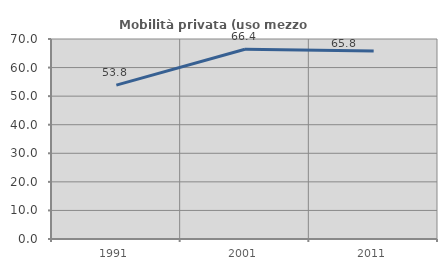
| Category | Mobilità privata (uso mezzo privato) |
|---|---|
| 1991.0 | 53.84 |
| 2001.0 | 66.405 |
| 2011.0 | 65.81 |